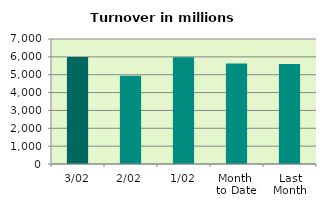
| Category | Series 0 |
|---|---|
| 3/02 | 5985.9 |
| 2/02 | 4936.273 |
| 1/02 | 5971.33 |
| Month 
to Date | 5631.168 |
| Last
Month | 5596.977 |